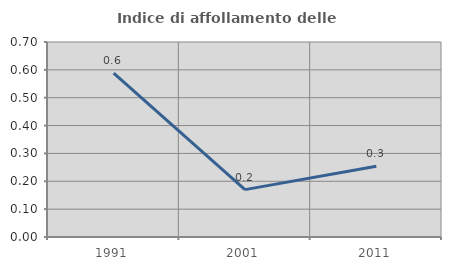
| Category | Indice di affollamento delle abitazioni  |
|---|---|
| 1991.0 | 0.588 |
| 2001.0 | 0.17 |
| 2011.0 | 0.254 |